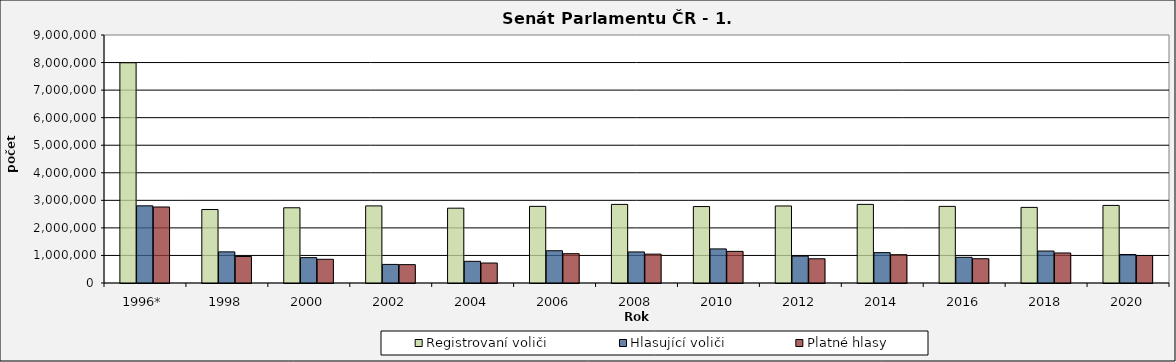
| Category | Registrovaní voliči | Hlasující voliči | Platné hlasy |
|---|---|---|---|
| 1996* | 7992740 | 2800108 | 2758125 |
| 1998 | 2666398 | 1129648 | 962111 |
| 2000 | 2730142 | 920704 | 860442 |
| 2002 | 2797846 | 674333 | 666455 |
| 2004 | 2715437 | 786732 | 724686 |
| 2006 | 2780914 | 1170474 | 1063614 |
| 2008 | 2852506 | 1127259 | 1047358 |
| 2010 | 2774178 | 1237072 | 1147390 |
| 2012 | 2795405 | 975511 | 879222 |
| 2014 | 2853106 | 1101753 | 1026615 |
| 2016 | 2780706 | 932616 | 881170 |
| 2018 | 2743745 | 1159603 | 1089689 |
| 2020 | 2815827 | 1034469 | 997261 |